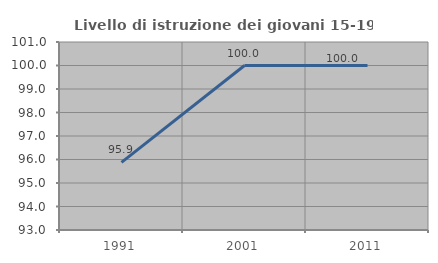
| Category | Livello di istruzione dei giovani 15-19 anni |
|---|---|
| 1991.0 | 95.876 |
| 2001.0 | 100 |
| 2011.0 | 100 |